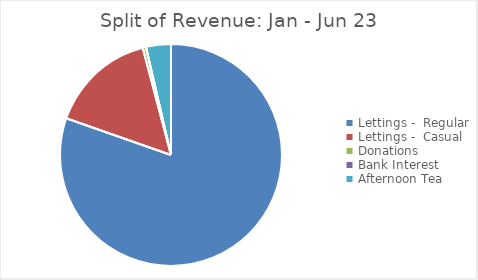
| Category | Series 0 |
|---|---|
| Lettings -  Regular | 16707.04 |
| Lettings -  Casual | 3227.5 |
| Donations  | 100 |
| Bank Interest | 0 |
| Afternoon Tea | 754.2 |